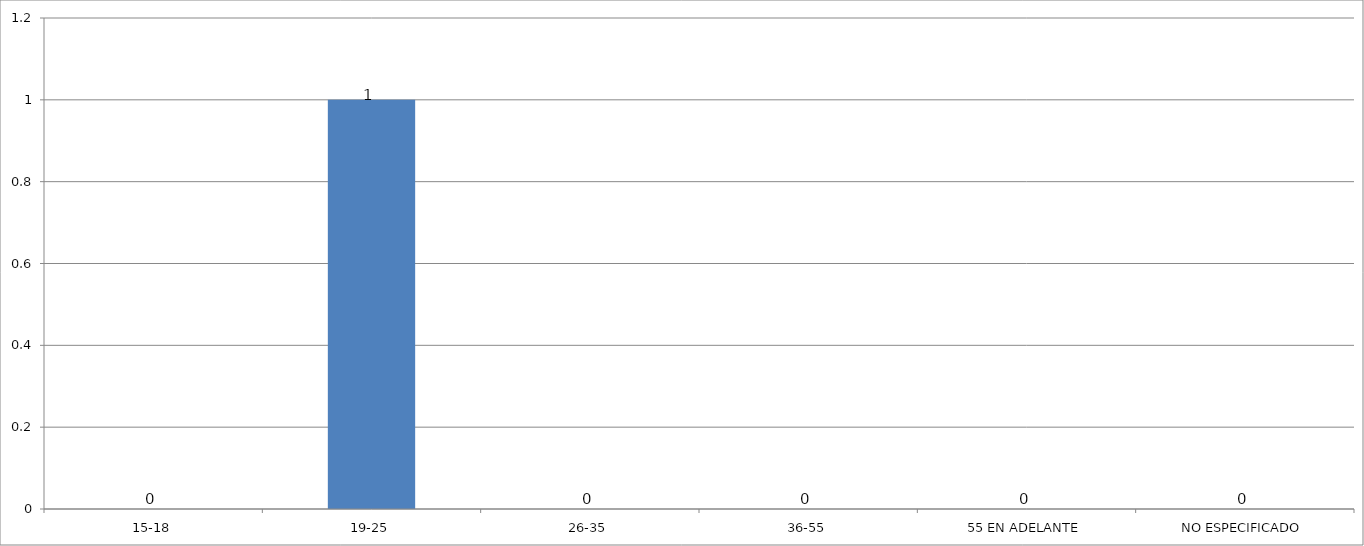
| Category | Series 0 |
|---|---|
| 15-18 | 0 |
| 19-25 | 1 |
| 26-35 | 0 |
| 36-55 | 0 |
| 55 EN ADELANTE | 0 |
| NO ESPECIFICADO | 0 |